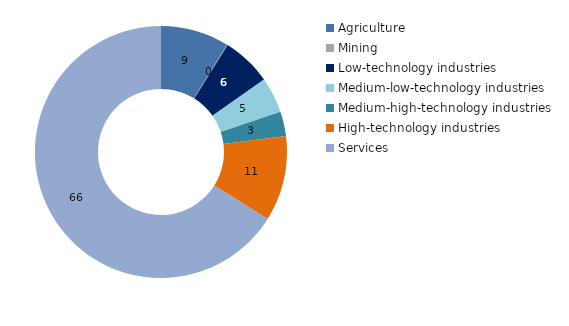
| Category | 2014 |
|---|---|
| Agriculture | 8.781 |
| Mining | 0.083 |
| Low-technology industries | 6.379 |
| Medium-low-technology industries | 4.597 |
| Medium-high-technology industries | 3.14 |
| High-technology industries | 10.958 |
| Services | 66.063 |